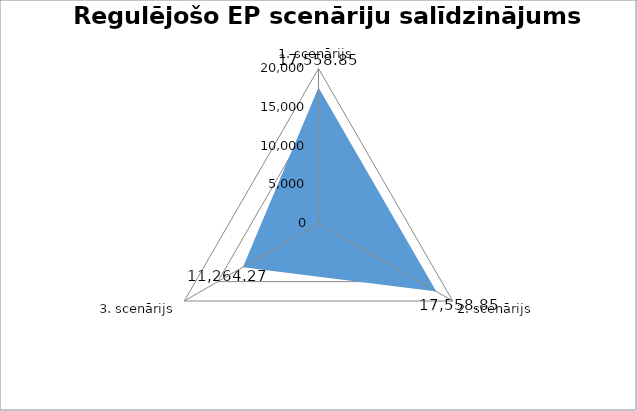
| Category | Series 0 |
|---|---|
| 1. scenārijs | 17558.851 |
| 2. scenārijs | 17558.851 |
| 3. scenārijs | 11264.274 |